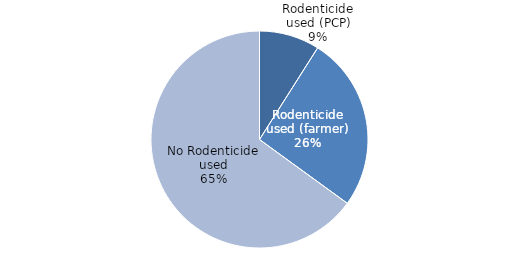
| Category | Series 0 |
|---|---|
| Rodenticide used (PCP) | 9 |
| Rodenticide used (farmer) | 26 |
| No Rodenticide used | 65 |